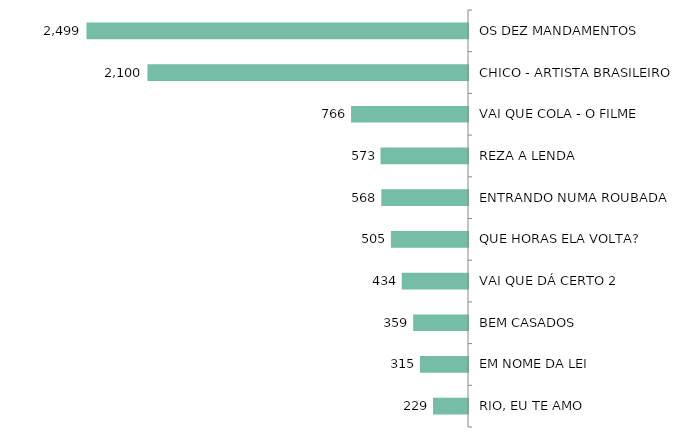
| Category | Series 0 |
|---|---|
| OS DEZ MANDAMENTOS | 2499 |
| CHICO - ARTISTA BRASILEIRO | 2100 |
| VAI QUE COLA - O FILME | 766 |
| REZA A LENDA | 573 |
| ENTRANDO NUMA ROUBADA | 568 |
| QUE HORAS ELA VOLTA? | 505 |
| VAI QUE DÁ CERTO 2 | 434 |
| BEM CASADOS | 359 |
| EM NOME DA LEI | 315 |
| RIO, EU TE AMO | 229 |